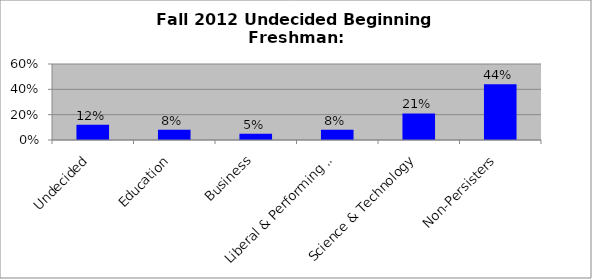
| Category | Series 0 |
|---|---|
| Undecided | 0.12 |
| Education | 0.08 |
| Business | 0.05 |
| Liberal & Performing Arts | 0.08 |
| Science & Technology | 0.21 |
| Non-Persisters | 0.44 |